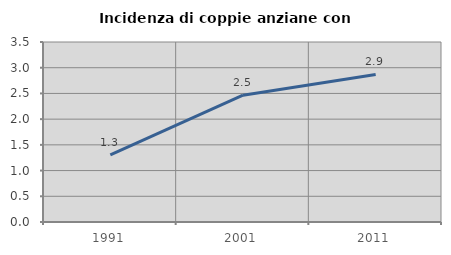
| Category | Incidenza di coppie anziane con figli |
|---|---|
| 1991.0 | 1.304 |
| 2001.0 | 2.465 |
| 2011.0 | 2.87 |